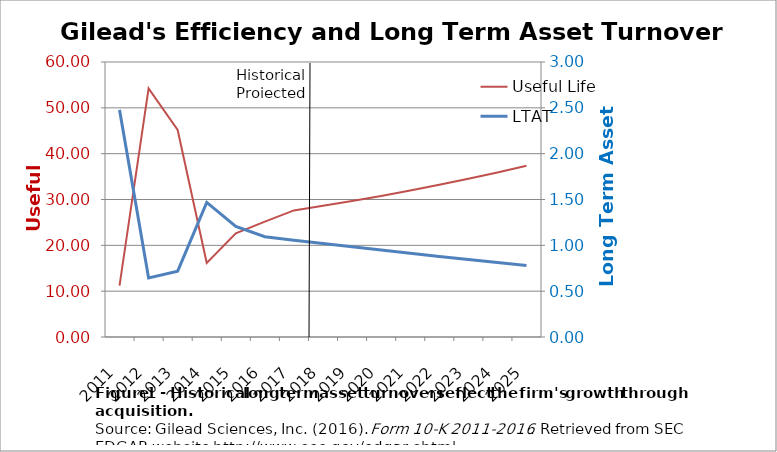
| Category | Useful Life |
|---|---|
| 2011.0 | 11.198 |
| 2012.0 | 54.257 |
| 2013.0 | 45.165 |
| 2014.0 | 16.143 |
| 2015.0 | 22.616 |
| 2016.0 | 25.175 |
| 2017.0 | 27.622 |
| 2018.0 | 28.62 |
| 2019.0 | 29.674 |
| 2020.0 | 30.787 |
| 2021.0 | 31.964 |
| 2022.0 | 33.207 |
| 2023.0 | 34.52 |
| 2024.0 | 35.907 |
| 2025.0 | 37.372 |